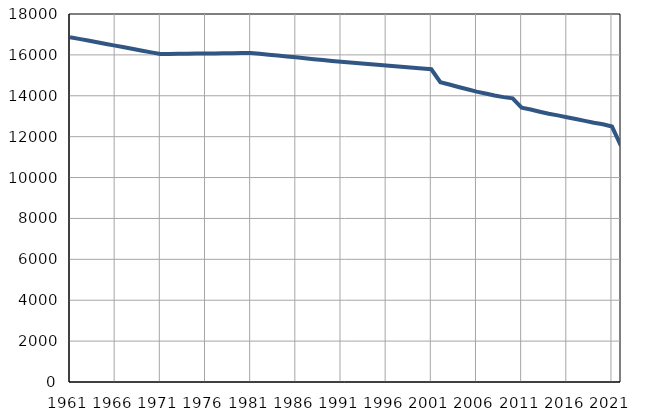
| Category | Population
size |
|---|---|
| 1961.0 | 16865 |
| 1962.0 | 16783 |
| 1963.0 | 16700 |
| 1964.0 | 16618 |
| 1965.0 | 16536 |
| 1966.0 | 16454 |
| 1967.0 | 16371 |
| 1968.0 | 16289 |
| 1969.0 | 16206 |
| 1970.0 | 16124 |
| 1971.0 | 16042 |
| 1972.0 | 16047 |
| 1973.0 | 16053 |
| 1974.0 | 16058 |
| 1975.0 | 16063 |
| 1976.0 | 16068 |
| 1977.0 | 16074 |
| 1978.0 | 16079 |
| 1979.0 | 16084 |
| 1980.0 | 16090 |
| 1981.0 | 16095 |
| 1982.0 | 16052 |
| 1983.0 | 16008 |
| 1984.0 | 15965 |
| 1985.0 | 15922 |
| 1986.0 | 15879 |
| 1987.0 | 15836 |
| 1988.0 | 15792 |
| 1989.0 | 15748 |
| 1990.0 | 15705 |
| 1991.0 | 15662 |
| 1992.0 | 15626 |
| 1993.0 | 15589 |
| 1994.0 | 15553 |
| 1995.0 | 15517 |
| 1996.0 | 15480 |
| 1997.0 | 15444 |
| 1998.0 | 15407 |
| 1999.0 | 15371 |
| 2000.0 | 15335 |
| 2001.0 | 15298 |
| 2002.0 | 14662 |
| 2003.0 | 14550 |
| 2004.0 | 14429 |
| 2005.0 | 14317 |
| 2006.0 | 14205 |
| 2007.0 | 14108 |
| 2008.0 | 14013 |
| 2009.0 | 13935 |
| 2010.0 | 13873 |
| 2011.0 | 13418 |
| 2012.0 | 13329 |
| 2013.0 | 13222 |
| 2014.0 | 13122 |
| 2015.0 | 13042 |
| 2016.0 | 12952 |
| 2017.0 | 12864 |
| 2018.0 | 12772 |
| 2019.0 | 12679 |
| 2020.0 | 12605 |
| 2021.0 | 12495 |
| 2022.0 | 11550 |